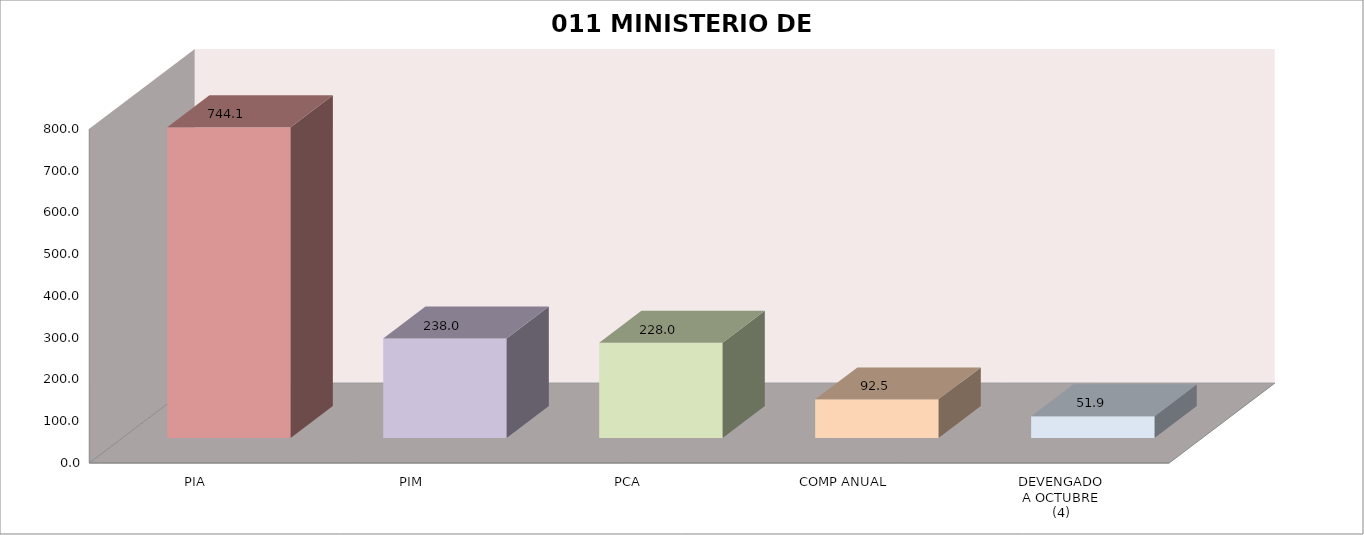
| Category | 011 MINISTERIO DE SALUD |
|---|---|
| PIA | 744.088 |
| PIM | 238.043 |
| PCA | 228.043 |
| COMP ANUAL | 92.543 |
| DEVENGADO
A OCTUBRE
(4) | 51.905 |